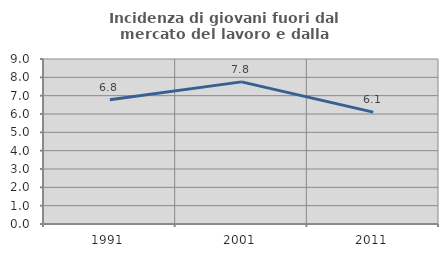
| Category | Incidenza di giovani fuori dal mercato del lavoro e dalla formazione  |
|---|---|
| 1991.0 | 6.775 |
| 2001.0 | 7.752 |
| 2011.0 | 6.103 |